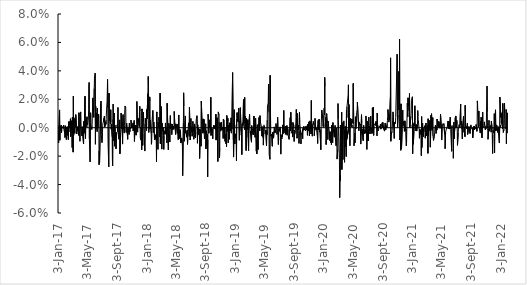
| Category | Series 0 |
|---|---|
| 2017-01-03 | -0.01 |
| 2017-01-04 | -0.005 |
| 2017-01-05 | -0.011 |
| 2017-01-06 | 0.001 |
| 2017-01-09 | 0.013 |
| 2017-01-10 | -0.009 |
| 2017-01-11 | 0.002 |
| 2017-01-12 | -0.002 |
| 2017-01-13 | 0 |
| 2017-01-16 | 0.002 |
| 2017-01-17 | -0.004 |
| 2017-01-18 | -0.001 |
| 2017-01-19 | -0.002 |
| 2017-01-20 | 0.001 |
| 2017-01-23 | 0 |
| 2017-01-24 | -0.001 |
| 2017-01-25 | 0.001 |
| 2017-01-26 | 0.002 |
| 2017-01-27 | 0.001 |
| 2017-01-30 | -0.004 |
| 2017-01-31 | -0.007 |
| 2017-02-01 | -0.005 |
| 2017-02-02 | 0.001 |
| 2017-02-03 | -0.005 |
| 2017-02-06 | -0.008 |
| 2017-02-07 | -0.005 |
| 2017-02-08 | 0.001 |
| 2017-02-09 | -0.005 |
| 2017-02-10 | 0.001 |
| 2017-02-13 | -0.004 |
| 2017-02-14 | -0.008 |
| 2017-02-15 | 0.004 |
| 2017-02-16 | -0.003 |
| 2017-02-17 | 0.004 |
| 2017-02-20 | 0.003 |
| 2017-02-21 | 0 |
| 2017-02-22 | 0 |
| 2017-02-23 | 0.006 |
| 2017-02-24 | -0.006 |
| 2017-02-27 | 0.005 |
| 2017-02-28 | -0.002 |
| 2017-03-01 | -0.006 |
| 2017-03-02 | -0.014 |
| 2017-03-03 | 0.007 |
| 2017-03-06 | -0.017 |
| 2017-03-07 | 0.022 |
| 2017-03-08 | -0.005 |
| 2017-03-09 | 0.007 |
| 2017-03-10 | 0.003 |
| 2017-03-13 | -0.004 |
| 2017-03-14 | 0.006 |
| 2017-03-15 | 0.001 |
| 2017-03-16 | 0.005 |
| 2017-03-17 | 0.009 |
| 2017-03-20 | 0.001 |
| 2017-03-21 | -0.004 |
| 2017-03-22 | -0.002 |
| 2017-03-23 | 0 |
| 2017-03-24 | -0.002 |
| 2017-03-27 | 0.001 |
| 2017-03-28 | -0.003 |
| 2017-03-29 | -0.005 |
| 2017-03-30 | 0.011 |
| 2017-03-31 | -0.001 |
| 2017-04-03 | -0.01 |
| 2017-04-04 | 0 |
| 2017-04-05 | 0.008 |
| 2017-04-06 | 0.011 |
| 2017-04-07 | 0 |
| 2017-04-10 | -0.005 |
| 2017-04-11 | -0.006 |
| 2017-04-12 | 0.001 |
| 2017-04-13 | 0.001 |
| 2017-04-18 | -0.011 |
| 2017-04-19 | 0.005 |
| 2017-04-20 | -0.002 |
| 2017-04-21 | -0.004 |
| 2017-04-24 | 0.022 |
| 2017-04-25 | 0.003 |
| 2017-04-26 | -0.008 |
| 2017-04-27 | 0.005 |
| 2017-04-28 | 0.001 |
| 2017-05-02 | 0.008 |
| 2017-05-03 | 0.006 |
| 2017-05-04 | 0.002 |
| 2017-05-05 | 0.003 |
| 2017-05-08 | 0.007 |
| 2017-05-09 | 0.013 |
| 2017-05-10 | 0.03 |
| 2017-05-11 | 0.032 |
| 2017-05-12 | -0.008 |
| 2017-05-15 | -0.024 |
| 2017-05-16 | 0.003 |
| 2017-05-17 | 0.011 |
| 2017-05-18 | 0.007 |
| 2017-05-19 | 0 |
| 2017-05-22 | -0.001 |
| 2017-05-23 | 0.001 |
| 2017-05-24 | 0.006 |
| 2017-05-25 | 0.006 |
| 2017-05-26 | 0.021 |
| 2017-05-30 | 0.007 |
| 2017-05-31 | 0.008 |
| 2017-06-01 | 0.028 |
| 2017-06-02 | 0.035 |
| 2017-06-05 | 0.038 |
| 2017-06-06 | -0.012 |
| 2017-06-07 | 0.015 |
| 2017-06-08 | 0.008 |
| 2017-06-09 | 0.01 |
| 2017-06-12 | -0.001 |
| 2017-06-13 | -0.003 |
| 2017-06-14 | 0.014 |
| 2017-06-15 | 0.006 |
| 2017-06-16 | 0 |
| 2017-06-19 | 0.01 |
| 2017-06-20 | 0.007 |
| 2017-06-21 | -0.026 |
| 2017-06-22 | -0.016 |
| 2017-06-23 | -0.024 |
| 2017-06-28 | 0.017 |
| 2017-06-29 | 0.019 |
| 2017-06-30 | -0.005 |
| 2017-07-03 | -0.01 |
| 2017-07-04 | -0.011 |
| 2017-07-05 | -0.003 |
| 2017-07-06 | 0.002 |
| 2017-07-07 | 0.003 |
| 2017-07-10 | 0.005 |
| 2017-07-11 | 0.007 |
| 2017-07-12 | 0.005 |
| 2017-07-13 | 0.008 |
| 2017-07-14 | 0 |
| 2017-07-17 | 0.001 |
| 2017-07-18 | 0.004 |
| 2017-07-19 | 0.002 |
| 2017-07-20 | 0.005 |
| 2017-07-21 | 0.01 |
| 2017-07-24 | 0.019 |
| 2017-07-25 | 0.025 |
| 2017-07-26 | 0.034 |
| 2017-07-27 | 0.014 |
| 2017-07-28 | -0.01 |
| 2017-07-31 | -0.028 |
| 2017-08-01 | 0.024 |
| 2017-08-02 | 0.005 |
| 2017-08-03 | 0.006 |
| 2017-08-04 | 0.008 |
| 2017-08-07 | 0.003 |
| 2017-08-08 | 0.013 |
| 2017-08-09 | 0.004 |
| 2017-08-10 | -0.001 |
| 2017-08-11 | 0.003 |
| 2017-08-14 | -0.006 |
| 2017-08-15 | -0.023 |
| 2017-08-16 | -0.027 |
| 2017-08-17 | 0.006 |
| 2017-08-18 | 0.017 |
| 2017-08-21 | -0.009 |
| 2017-08-22 | 0.01 |
| 2017-08-23 | 0.003 |
| 2017-08-24 | -0.013 |
| 2017-08-25 | 0.002 |
| 2017-08-28 | -0.009 |
| 2017-08-29 | -0.004 |
| 2017-08-30 | -0.015 |
| 2017-08-31 | -0.003 |
| 2017-09-05 | -0.003 |
| 2017-09-06 | 0.006 |
| 2017-09-07 | 0.014 |
| 2017-09-08 | -0.004 |
| 2017-09-11 | -0.008 |
| 2017-09-12 | -0.007 |
| 2017-09-13 | 0.002 |
| 2017-09-14 | 0.006 |
| 2017-09-15 | -0.018 |
| 2017-09-18 | -0.004 |
| 2017-09-19 | -0.001 |
| 2017-09-20 | 0.01 |
| 2017-09-21 | -0.001 |
| 2017-09-22 | 0.009 |
| 2017-09-25 | -0.004 |
| 2017-09-26 | -0.012 |
| 2017-09-27 | 0.004 |
| 2017-09-28 | 0.009 |
| 2017-09-29 | 0 |
| 2017-10-03 | -0.004 |
| 2017-10-04 | 0.001 |
| 2017-10-05 | 0.012 |
| 2017-10-06 | 0.015 |
| 2017-10-09 | 0.014 |
| 2017-10-10 | -0.002 |
| 2017-10-11 | -0.003 |
| 2017-10-12 | 0.002 |
| 2017-10-13 | 0.003 |
| 2017-10-16 | 0.003 |
| 2017-10-17 | -0.008 |
| 2017-10-18 | -0.001 |
| 2017-10-19 | 0 |
| 2017-10-20 | -0.002 |
| 2017-10-23 | -0.005 |
| 2017-10-24 | 0.003 |
| 2017-10-25 | 0.002 |
| 2017-10-26 | -0.003 |
| 2017-10-27 | -0.002 |
| 2017-10-30 | 0.001 |
| 2017-10-31 | 0.005 |
| 2017-11-01 | 0.006 |
| 2017-11-02 | 0 |
| 2017-11-03 | 0.002 |
| 2017-11-06 | 0 |
| 2017-11-07 | 0.002 |
| 2017-11-08 | 0.003 |
| 2017-11-09 | -0.002 |
| 2017-11-10 | 0.002 |
| 2017-11-13 | 0.005 |
| 2017-11-14 | -0.01 |
| 2017-11-15 | -0.009 |
| 2017-11-16 | 0 |
| 2017-11-17 | 0.002 |
| 2017-11-20 | 0.002 |
| 2017-11-21 | -0.005 |
| 2017-11-22 | 0 |
| 2017-11-23 | 0.002 |
| 2017-11-24 | 0.018 |
| 2017-11-27 | -0.003 |
| 2017-11-28 | 0.007 |
| 2017-11-29 | 0.005 |
| 2017-11-30 | 0.006 |
| 2017-12-04 | 0.001 |
| 2017-12-05 | 0.014 |
| 2017-12-06 | 0.015 |
| 2017-12-07 | 0.012 |
| 2017-12-08 | -0.007 |
| 2017-12-11 | -0.009 |
| 2017-12-12 | 0 |
| 2017-12-13 | -0.01 |
| 2017-12-14 | -0.016 |
| 2017-12-15 | 0.013 |
| 2017-12-18 | -0.012 |
| 2017-12-19 | -0.005 |
| 2017-12-20 | 0.004 |
| 2017-12-21 | 0.011 |
| 2017-12-22 | 0.004 |
| 2017-12-27 | -0.016 |
| 2017-12-28 | 0.003 |
| 2017-12-29 | 0.007 |
| 2018-01-02 | 0.001 |
| 2018-01-03 | -0.002 |
| 2018-01-04 | 0.013 |
| 2018-01-05 | 0.006 |
| 2018-01-08 | 0.024 |
| 2018-01-09 | 0.013 |
| 2018-01-10 | 0.036 |
| 2018-01-11 | 0.029 |
| 2018-01-12 | -0.003 |
| 2018-01-15 | 0.005 |
| 2018-01-16 | 0.022 |
| 2018-01-17 | 0.019 |
| 2018-01-18 | -0.001 |
| 2018-01-19 | 0.005 |
| 2018-01-22 | -0.004 |
| 2018-01-23 | -0.012 |
| 2018-01-24 | -0.01 |
| 2018-01-25 | -0.01 |
| 2018-01-26 | 0.006 |
| 2018-01-29 | 0.012 |
| 2018-01-30 | 0.004 |
| 2018-01-31 | -0.003 |
| 2018-02-01 | 0.003 |
| 2018-02-02 | 0.004 |
| 2018-02-05 | -0.008 |
| 2018-02-06 | -0.009 |
| 2018-02-07 | -0.008 |
| 2018-02-08 | -0.005 |
| 2018-02-09 | -0.005 |
| 2018-02-12 | -0.009 |
| 2018-02-13 | -0.024 |
| 2018-02-14 | 0.011 |
| 2018-02-15 | 0.01 |
| 2018-02-16 | 0.001 |
| 2018-02-19 | -0.015 |
| 2018-02-20 | 0.004 |
| 2018-02-21 | 0 |
| 2018-02-22 | 0.002 |
| 2018-02-23 | 0.007 |
| 2018-02-26 | 0 |
| 2018-02-27 | -0.007 |
| 2018-02-28 | 0.024 |
| 2018-03-01 | -0.011 |
| 2018-03-02 | 0.001 |
| 2018-03-05 | 0.015 |
| 2018-03-06 | 0.002 |
| 2018-03-07 | -0.015 |
| 2018-03-08 | 0.003 |
| 2018-03-09 | 0.002 |
| 2018-03-12 | -0.003 |
| 2018-03-13 | 0 |
| 2018-03-14 | -0.005 |
| 2018-03-15 | -0.015 |
| 2018-03-16 | -0.006 |
| 2018-03-19 | -0.002 |
| 2018-03-20 | -0.004 |
| 2018-03-21 | -0.005 |
| 2018-03-22 | 0.003 |
| 2018-03-23 | -0.004 |
| 2018-03-26 | 0 |
| 2018-03-27 | -0.005 |
| 2018-03-28 | -0.011 |
| 2018-03-29 | 0.017 |
| 2018-04-03 | -0.016 |
| 2018-04-04 | -0.003 |
| 2018-04-05 | 0.003 |
| 2018-04-06 | -0.001 |
| 2018-04-09 | -0.01 |
| 2018-04-10 | 0.002 |
| 2018-04-11 | 0.009 |
| 2018-04-12 | -0.001 |
| 2018-04-13 | 0.003 |
| 2018-04-16 | 0.001 |
| 2018-04-17 | -0.005 |
| 2018-04-18 | 0 |
| 2018-04-19 | 0.002 |
| 2018-04-20 | -0.001 |
| 2018-04-23 | -0.001 |
| 2018-04-24 | 0.001 |
| 2018-04-25 | -0.001 |
| 2018-04-26 | 0.001 |
| 2018-04-27 | 0.011 |
| 2018-04-30 | 0.001 |
| 2018-05-02 | 0.001 |
| 2018-05-03 | -0.005 |
| 2018-05-04 | 0.003 |
| 2018-05-07 | 0 |
| 2018-05-08 | -0.002 |
| 2018-05-09 | -0.002 |
| 2018-05-10 | -0.004 |
| 2018-05-11 | 0.003 |
| 2018-05-14 | -0.008 |
| 2018-05-15 | -0.001 |
| 2018-05-16 | 0.009 |
| 2018-05-17 | -0.008 |
| 2018-05-18 | -0.005 |
| 2018-05-21 | -0.001 |
| 2018-05-22 | -0.004 |
| 2018-05-23 | -0.002 |
| 2018-05-24 | -0.011 |
| 2018-05-25 | -0.01 |
| 2018-05-28 | -0.007 |
| 2018-05-30 | -0.011 |
| 2018-05-31 | -0.013 |
| 2018-06-01 | -0.034 |
| 2018-06-04 | 0.004 |
| 2018-06-05 | 0.025 |
| 2018-06-06 | 0.015 |
| 2018-06-07 | 0.016 |
| 2018-06-08 | -0.01 |
| 2018-06-11 | 0.005 |
| 2018-06-12 | 0.008 |
| 2018-06-13 | -0.003 |
| 2018-06-14 | -0.003 |
| 2018-06-19 | -0.007 |
| 2018-06-20 | -0.002 |
| 2018-06-21 | -0.012 |
| 2018-06-22 | -0.008 |
| 2018-06-25 | 0.003 |
| 2018-06-26 | 0 |
| 2018-06-27 | -0.001 |
| 2018-06-28 | -0.006 |
| 2018-06-29 | 0.014 |
| 2018-07-02 | -0.009 |
| 2018-07-03 | -0.009 |
| 2018-07-04 | -0.003 |
| 2018-07-05 | 0.007 |
| 2018-07-06 | -0.003 |
| 2018-07-09 | 0.001 |
| 2018-07-10 | -0.006 |
| 2018-07-11 | -0.005 |
| 2018-07-12 | -0.001 |
| 2018-07-13 | 0.004 |
| 2018-07-16 | -0.003 |
| 2018-07-17 | -0.008 |
| 2018-07-18 | -0.006 |
| 2018-07-19 | -0.007 |
| 2018-07-20 | 0.003 |
| 2018-07-23 | 0.003 |
| 2018-07-24 | -0.007 |
| 2018-07-25 | -0.003 |
| 2018-07-26 | 0.002 |
| 2018-07-27 | 0.006 |
| 2018-07-30 | 0.008 |
| 2018-07-31 | 0.002 |
| 2018-08-01 | -0.011 |
| 2018-08-02 | 0.002 |
| 2018-08-03 | -0.005 |
| 2018-08-06 | -0.001 |
| 2018-08-07 | -0.004 |
| 2018-08-08 | -0.001 |
| 2018-08-09 | -0.002 |
| 2018-08-10 | -0.022 |
| 2018-08-13 | -0.001 |
| 2018-08-14 | -0.003 |
| 2018-08-15 | -0.006 |
| 2018-08-16 | -0.013 |
| 2018-08-17 | 0.019 |
| 2018-08-20 | 0.002 |
| 2018-08-23 | -0.004 |
| 2018-08-24 | 0.006 |
| 2018-08-27 | -0.003 |
| 2018-08-28 | 0.006 |
| 2018-08-29 | -0.004 |
| 2018-08-30 | -0.008 |
| 2018-08-31 | -0.007 |
| 2018-09-03 | 0 |
| 2018-09-04 | 0.003 |
| 2018-09-05 | -0.015 |
| 2018-09-06 | -0.009 |
| 2018-09-07 | -0.002 |
| 2018-09-10 | -0.013 |
| 2018-09-11 | -0.005 |
| 2018-09-12 | -0.035 |
| 2018-09-13 | -0.008 |
| 2018-09-14 | 0.01 |
| 2018-09-17 | -0.004 |
| 2018-09-18 | 0.006 |
| 2018-09-19 | 0 |
| 2018-09-20 | 0.003 |
| 2018-09-21 | 0.002 |
| 2018-09-24 | -0.003 |
| 2018-09-25 | 0.021 |
| 2018-09-26 | -0.005 |
| 2018-09-27 | -0.006 |
| 2018-09-28 | 0 |
| 2018-10-02 | -0.002 |
| 2018-10-03 | -0.008 |
| 2018-10-04 | -0.001 |
| 2018-10-05 | -0.001 |
| 2018-10-08 | 0.002 |
| 2018-10-09 | -0.001 |
| 2018-10-10 | -0.001 |
| 2018-10-11 | 0.001 |
| 2018-10-12 | 0.001 |
| 2018-10-15 | -0.001 |
| 2018-10-16 | 0.01 |
| 2018-10-17 | -0.009 |
| 2018-10-18 | 0.007 |
| 2018-10-19 | 0.005 |
| 2018-10-22 | 0.004 |
| 2018-10-23 | 0.007 |
| 2018-10-24 | -0.024 |
| 2018-10-25 | 0.004 |
| 2018-10-26 | 0.011 |
| 2018-10-29 | 0.009 |
| 2018-10-30 | -0.001 |
| 2018-10-31 | -0.021 |
| 2018-11-01 | -0.014 |
| 2018-11-02 | 0.004 |
| 2018-11-05 | -0.002 |
| 2018-11-06 | 0.003 |
| 2018-11-07 | -0.001 |
| 2018-11-08 | 0.004 |
| 2018-11-09 | -0.001 |
| 2018-11-12 | -0.002 |
| 2018-11-13 | 0 |
| 2018-11-14 | -0.001 |
| 2018-11-15 | -0.008 |
| 2018-11-16 | 0.006 |
| 2018-11-19 | 0.005 |
| 2018-11-21 | -0.008 |
| 2018-11-22 | 0 |
| 2018-11-23 | -0.01 |
| 2018-11-26 | -0.005 |
| 2018-11-27 | -0.011 |
| 2018-11-28 | -0.005 |
| 2018-11-29 | -0.013 |
| 2018-11-30 | 0.009 |
| 2018-12-03 | -0.002 |
| 2018-12-04 | 0.007 |
| 2018-12-05 | 0.005 |
| 2018-12-06 | -0.011 |
| 2018-12-07 | 0.002 |
| 2018-12-10 | -0.008 |
| 2018-12-11 | 0.003 |
| 2018-12-12 | -0.002 |
| 2018-12-13 | -0.002 |
| 2018-12-14 | 0.003 |
| 2018-12-17 | -0.002 |
| 2018-12-18 | 0.007 |
| 2018-12-19 | -0.004 |
| 2018-12-20 | 0.003 |
| 2018-12-21 | -0.001 |
| 2018-12-24 | 0.039 |
| 2018-12-27 | -0.009 |
| 2018-12-28 | -0.021 |
| 2018-12-31 | 0.013 |
| 2019-01-02 | -0.011 |
| 2019-01-03 | -0.01 |
| 2019-01-04 | -0.004 |
| 2019-01-07 | -0.008 |
| 2019-01-08 | -0.012 |
| 2019-01-09 | -0.023 |
| 2019-01-10 | 0.006 |
| 2019-01-11 | 0.011 |
| 2019-01-14 | 0.004 |
| 2019-01-15 | 0.006 |
| 2019-01-16 | 0.011 |
| 2019-01-17 | 0.004 |
| 2019-01-18 | 0.014 |
| 2019-01-21 | -0.009 |
| 2019-01-22 | 0 |
| 2019-01-23 | 0.005 |
| 2019-01-24 | 0.004 |
| 2019-01-25 | 0.014 |
| 2019-01-28 | -0.003 |
| 2019-01-29 | -0.005 |
| 2019-01-30 | -0.001 |
| 2019-01-31 | -0.019 |
| 2019-02-01 | 0.003 |
| 2019-02-04 | 0.004 |
| 2019-02-05 | 0.001 |
| 2019-02-06 | 0.002 |
| 2019-02-07 | 0.02 |
| 2019-02-08 | 0.003 |
| 2019-02-11 | 0.008 |
| 2019-02-12 | 0.021 |
| 2019-02-13 | -0.001 |
| 2019-02-14 | 0.001 |
| 2019-02-15 | 0.008 |
| 2019-02-18 | -0.016 |
| 2019-02-19 | 0.007 |
| 2019-02-20 | 0.006 |
| 2019-02-21 | -0.001 |
| 2019-02-22 | -0.002 |
| 2019-02-25 | 0.006 |
| 2019-02-26 | -0.007 |
| 2019-02-27 | -0.007 |
| 2019-02-28 | -0.016 |
| 2019-03-01 | 0.003 |
| 2019-03-04 | 0.01 |
| 2019-03-05 | 0.001 |
| 2019-03-06 | -0.002 |
| 2019-03-07 | -0.003 |
| 2019-03-08 | -0.003 |
| 2019-03-11 | -0.009 |
| 2019-03-12 | -0.01 |
| 2019-03-13 | 0.001 |
| 2019-03-14 | -0.005 |
| 2019-03-15 | -0.002 |
| 2019-03-18 | -0.001 |
| 2019-03-19 | -0.001 |
| 2019-03-20 | -0.001 |
| 2019-03-21 | -0.005 |
| 2019-03-22 | 0.008 |
| 2019-03-25 | -0.003 |
| 2019-03-26 | 0 |
| 2019-03-27 | -0.007 |
| 2019-03-28 | 0 |
| 2019-03-29 | 0.007 |
| 2019-04-01 | -0.017 |
| 2019-04-02 | -0.01 |
| 2019-04-03 | -0.018 |
| 2019-04-04 | -0.004 |
| 2019-04-05 | 0.002 |
| 2019-04-08 | -0.015 |
| 2019-04-09 | 0 |
| 2019-04-10 | 0.001 |
| 2019-04-11 | 0.005 |
| 2019-04-12 | 0.007 |
| 2019-04-15 | -0.002 |
| 2019-04-16 | 0.008 |
| 2019-04-17 | 0.008 |
| 2019-04-18 | 0.004 |
| 2019-04-23 | 0 |
| 2019-04-24 | -0.006 |
| 2019-04-25 | 0.001 |
| 2019-04-26 | -0.006 |
| 2019-04-29 | -0.007 |
| 2019-04-30 | -0.012 |
| 2019-05-02 | 0 |
| 2019-05-03 | 0.001 |
| 2019-05-06 | -0.001 |
| 2019-05-07 | -0.003 |
| 2019-05-08 | -0.004 |
| 2019-05-09 | -0.002 |
| 2019-05-10 | -0.002 |
| 2019-05-13 | -0.013 |
| 2019-05-14 | -0.002 |
| 2019-05-15 | -0.005 |
| 2019-05-16 | 0.005 |
| 2019-05-17 | 0.015 |
| 2019-05-20 | 0.017 |
| 2019-05-21 | 0.029 |
| 2019-05-22 | 0.031 |
| 2019-05-23 | 0.011 |
| 2019-05-24 | -0.019 |
| 2019-05-27 | -0.022 |
| 2019-05-28 | 0.037 |
| 2019-05-30 | -0.002 |
| 2019-05-31 | -0.006 |
| 2019-06-03 | -0.004 |
| 2019-06-06 | -0.013 |
| 2019-06-07 | -0.003 |
| 2019-06-10 | -0.004 |
| 2019-06-11 | -0.007 |
| 2019-06-13 | -0.002 |
| 2019-06-14 | 0.001 |
| 2019-06-17 | -0.004 |
| 2019-06-18 | -0.004 |
| 2019-06-19 | -0.002 |
| 2019-06-20 | 0 |
| 2019-06-21 | 0.003 |
| 2019-06-24 | -0.001 |
| 2019-06-25 | -0.005 |
| 2019-06-26 | -0.002 |
| 2019-06-27 | 0.005 |
| 2019-06-28 | 0.007 |
| 2019-07-01 | -0.012 |
| 2019-07-02 | -0.007 |
| 2019-07-03 | -0.001 |
| 2019-07-04 | -0.003 |
| 2019-07-05 | -0.001 |
| 2019-07-08 | 0.001 |
| 2019-07-09 | 0.001 |
| 2019-07-10 | -0.002 |
| 2019-07-11 | -0.019 |
| 2019-07-12 | -0.005 |
| 2019-07-15 | -0.008 |
| 2019-07-16 | -0.005 |
| 2019-07-17 | -0.006 |
| 2019-07-18 | -0.006 |
| 2019-07-19 | 0.002 |
| 2019-07-22 | -0.004 |
| 2019-07-23 | 0.012 |
| 2019-07-24 | -0.002 |
| 2019-07-25 | -0.003 |
| 2019-07-26 | -0.003 |
| 2019-07-29 | 0.001 |
| 2019-07-30 | -0.005 |
| 2019-07-31 | -0.004 |
| 2019-08-01 | 0.001 |
| 2019-08-02 | -0.004 |
| 2019-08-05 | 0.002 |
| 2019-08-06 | -0.005 |
| 2019-08-07 | -0.004 |
| 2019-08-08 | 0 |
| 2019-08-09 | -0.004 |
| 2019-08-14 | -0.008 |
| 2019-08-15 | -0.001 |
| 2019-08-16 | -0.005 |
| 2019-08-19 | 0.007 |
| 2019-08-20 | -0.002 |
| 2019-08-21 | 0.011 |
| 2019-08-22 | 0.01 |
| 2019-08-23 | 0.006 |
| 2019-08-26 | -0.004 |
| 2019-08-27 | -0.003 |
| 2019-08-28 | 0 |
| 2019-08-29 | -0.007 |
| 2019-08-30 | 0.004 |
| 2019-09-02 | 0.001 |
| 2019-09-03 | 0.001 |
| 2019-09-04 | -0.01 |
| 2019-09-05 | -0.002 |
| 2019-09-06 | -0.005 |
| 2019-09-09 | -0.002 |
| 2019-09-10 | -0.002 |
| 2019-09-11 | 0.004 |
| 2019-09-12 | 0.01 |
| 2019-09-13 | 0.013 |
| 2019-09-16 | -0.007 |
| 2019-09-17 | -0.006 |
| 2019-09-18 | 0.01 |
| 2019-09-19 | -0.001 |
| 2019-09-20 | 0.002 |
| 2019-09-23 | -0.001 |
| 2019-09-24 | -0.011 |
| 2019-09-25 | -0.003 |
| 2019-09-26 | 0.011 |
| 2019-09-27 | 0.003 |
| 2019-09-30 | -0.002 |
| 2019-10-02 | -0.011 |
| 2019-10-03 | -0.008 |
| 2019-10-04 | -0.004 |
| 2019-10-07 | -0.004 |
| 2019-10-08 | -0.002 |
| 2019-10-09 | -0.008 |
| 2019-10-10 | -0.001 |
| 2019-10-11 | -0.002 |
| 2019-10-14 | 0.001 |
| 2019-10-15 | -0.002 |
| 2019-10-16 | -0.002 |
| 2019-10-17 | -0.001 |
| 2019-10-18 | 0 |
| 2019-10-21 | -0.002 |
| 2019-10-22 | -0.001 |
| 2019-10-23 | 0.001 |
| 2019-10-24 | -0.002 |
| 2019-10-25 | 0 |
| 2019-10-28 | 0.001 |
| 2019-10-29 | -0.005 |
| 2019-10-30 | 0.003 |
| 2019-10-31 | 0.002 |
| 2019-11-01 | -0.002 |
| 2019-11-04 | 0.004 |
| 2019-11-05 | -0.001 |
| 2019-11-06 | -0.006 |
| 2019-11-07 | -0.001 |
| 2019-11-08 | 0.005 |
| 2019-11-12 | 0.005 |
| 2019-11-13 | -0.004 |
| 2019-11-14 | 0.019 |
| 2019-11-15 | 0 |
| 2019-11-18 | -0.006 |
| 2019-11-19 | 0.002 |
| 2019-11-20 | 0.001 |
| 2019-11-21 | 0.004 |
| 2019-11-22 | 0.004 |
| 2019-11-25 | 0.002 |
| 2019-11-26 | -0.006 |
| 2019-11-27 | -0.003 |
| 2019-11-28 | 0.001 |
| 2019-11-29 | 0.007 |
| 2019-12-02 | 0 |
| 2019-12-03 | -0.002 |
| 2019-12-04 | 0 |
| 2019-12-05 | -0.001 |
| 2019-12-06 | -0.002 |
| 2019-12-09 | -0.006 |
| 2019-12-10 | -0.011 |
| 2019-12-11 | 0.002 |
| 2019-12-12 | 0.005 |
| 2019-12-13 | -0.001 |
| 2019-12-16 | 0.006 |
| 2019-12-17 | -0.001 |
| 2019-12-18 | 0 |
| 2019-12-19 | -0.003 |
| 2019-12-20 | -0.002 |
| 2019-12-23 | -0.015 |
| 2019-12-24 | -0.001 |
| 2019-12-27 | 0.012 |
| 2019-12-30 | 0.007 |
| 2019-12-31 | 0.009 |
| 2020-01-02 | 0.001 |
| 2020-01-03 | 0.004 |
| 2020-01-06 | 0.014 |
| 2020-01-07 | 0.009 |
| 2020-01-08 | 0.035 |
| 2020-01-09 | 0.029 |
| 2020-01-10 | 0.001 |
| 2020-01-13 | 0.007 |
| 2020-01-14 | -0.012 |
| 2020-01-15 | -0.008 |
| 2020-01-16 | 0.01 |
| 2020-01-17 | 0.009 |
| 2020-01-20 | 0.003 |
| 2020-01-21 | -0.008 |
| 2020-01-22 | 0 |
| 2020-01-23 | 0.005 |
| 2020-01-24 | 0.001 |
| 2020-01-27 | -0.003 |
| 2020-01-28 | -0.006 |
| 2020-01-29 | -0.009 |
| 2020-01-30 | -0.003 |
| 2020-01-31 | -0.006 |
| 2020-02-03 | -0.011 |
| 2020-02-04 | -0.004 |
| 2020-02-05 | -0.012 |
| 2020-02-06 | 0.002 |
| 2020-02-07 | -0.003 |
| 2020-02-10 | -0.011 |
| 2020-02-11 | 0.004 |
| 2020-02-12 | 0 |
| 2020-02-13 | 0 |
| 2020-02-14 | -0.004 |
| 2020-02-17 | -0.007 |
| 2020-02-18 | -0.001 |
| 2020-02-19 | -0.001 |
| 2020-02-20 | 0.002 |
| 2020-02-21 | -0.007 |
| 2020-02-24 | -0.013 |
| 2020-02-25 | 0 |
| 2020-02-26 | -0.002 |
| 2020-02-27 | -0.006 |
| 2020-02-28 | -0.022 |
| 2020-03-02 | -0.015 |
| 2020-03-03 | 0.017 |
| 2020-03-04 | 0.006 |
| 2020-03-05 | 0.001 |
| 2020-03-06 | -0.006 |
| 2020-03-09 | -0.024 |
| 2020-03-10 | -0.049 |
| 2020-03-11 | -0.033 |
| 2020-03-12 | -0.037 |
| 2020-03-13 | 0.002 |
| 2020-03-16 | -0.001 |
| 2020-03-17 | -0.007 |
| 2020-03-18 | 0.011 |
| 2020-03-19 | -0.029 |
| 2020-03-20 | 0.004 |
| 2020-03-23 | -0.022 |
| 2020-03-24 | 0.002 |
| 2020-03-25 | -0.001 |
| 2020-03-26 | 0.001 |
| 2020-03-27 | 0.005 |
| 2020-03-30 | -0.024 |
| 2020-03-31 | -0.001 |
| 2020-04-01 | -0.009 |
| 2020-04-02 | 0.001 |
| 2020-04-03 | -0.001 |
| 2020-04-06 | -0.02 |
| 2020-04-07 | 0.012 |
| 2020-04-08 | 0.007 |
| 2020-04-09 | 0.015 |
| 2020-04-14 | 0.023 |
| 2020-04-15 | 0.03 |
| 2020-04-16 | 0.001 |
| 2020-04-17 | 0.016 |
| 2020-04-20 | 0 |
| 2020-04-21 | -0.013 |
| 2020-04-22 | 0.007 |
| 2020-04-02 | -0.014 |
| 2020-04-24 | 0.006 |
| 2020-04-27 | 0.001 |
| 2020-04-28 | 0.005 |
| 2020-04-29 | 0.006 |
| 2020-04-30 | 0.007 |
| 2020-05-04 | 0.003 |
| 2020-05-05 | 0.031 |
| 2020-05-06 | 0.014 |
| 2020-05-07 | 0.009 |
| 2020-05-08 | -0.013 |
| 2020-05-11 | -0.004 |
| 2020-05-12 | -0.011 |
| 2020-05-13 | 0.001 |
| 2020-05-14 | 0.008 |
| 2020-05-15 | -0.001 |
| 2020-05-18 | 0.003 |
| 2020-05-19 | 0.011 |
| 2020-05-20 | 0.01 |
| 2020-05-21 | 0.013 |
| 2020-05-22 | 0.018 |
| 2020-05-27 | 0.001 |
| 2020-05-28 | -0.002 |
| 2020-05-29 | 0.004 |
| 2020-06-01 | 0.002 |
| 2020-06-02 | 0.003 |
| 2020-06-03 | 0.001 |
| 2020-06-04 | -0.004 |
| 2020-06-05 | -0.012 |
| 2020-06-08 | 0.009 |
| 2020-06-09 | 0.003 |
| 2020-06-10 | -0.005 |
| 2020-06-11 | -0.001 |
| 2020-06-15 | -0.009 |
| 2020-06-16 | -0.001 |
| 2020-06-17 | 0.002 |
| 2020-06-18 | -0.002 |
| 2020-06-19 | -0.004 |
| 2020-06-22 | -0.002 |
| 2020-06-23 | -0.001 |
| 2020-06-24 | -0.004 |
| 2020-06-25 | -0.001 |
| 2020-06-26 | 0.008 |
| 2020-06-29 | 0.001 |
| 2020-06-30 | -0.015 |
| 2020-07-01 | 0.005 |
| 2020-07-02 | -0.009 |
| 2020-07-03 | -0.002 |
| 2020-07-06 | -0.009 |
| 2020-07-07 | 0 |
| 2020-07-08 | 0.007 |
| 2020-07-09 | 0 |
| 2020-07-10 | 0.001 |
| 2020-07-13 | -0.004 |
| 2020-07-14 | -0.003 |
| 2020-07-15 | 0.001 |
| 2020-07-16 | 0.008 |
| 2020-07-17 | -0.002 |
| 2020-07-20 | -0.001 |
| 2020-07-21 | -0.004 |
| 2020-07-22 | 0 |
| 2020-07-23 | 0.014 |
| 2020-07-24 | -0.003 |
| 2020-07-27 | 0.015 |
| 2020-07-28 | -0.005 |
| 2020-07-29 | 0.002 |
| 2020-08-03 | 0.003 |
| 2020-08-04 | 0.003 |
| 2020-08-05 | 0.002 |
| 2020-08-06 | 0.002 |
| 2020-08-07 | 0.004 |
| 2020-08-10 | -0.001 |
| 2020-08-11 | -0.006 |
| 2020-08-12 | 0.01 |
| 2020-08-13 | 0.004 |
| 2020-08-14 | -0.001 |
| 2020-08-17 | -0.002 |
| 2020-08-18 | 0 |
| 2020-08-19 | 0.001 |
| 2020-08-20 | 0.001 |
| 2020-08-21 | 0.001 |
| 2020-08-24 | 0 |
| 2020-08-25 | 0.002 |
| 2020-08-26 | 0.002 |
| 2020-08-27 | -0.001 |
| 2020-08-28 | 0 |
| 2020-08-31 | 0.001 |
| 2020-09-01 | 0.003 |
| 2020-09-02 | 0.002 |
| 2020-09-03 | 0.002 |
| 2020-09-04 | 0.004 |
| 2020-09-07 | -0.001 |
| 2020-09-11 | -0.002 |
| 2020-09-14 | 0.003 |
| 2020-09-15 | 0 |
| 2020-09-16 | -0.002 |
| 2020-09-17 | -0.001 |
| 2020-09-18 | 0.002 |
| 2020-09-21 | 0 |
| 2020-09-22 | 0.003 |
| 2020-09-23 | 0.005 |
| 2020-09-24 | 0.008 |
| 2020-09-25 | 0.013 |
| 2020-09-28 | 0.007 |
| 2020-09-29 | 0.004 |
| 2020-09-30 | 0.008 |
| 2020-10-02 | 0.005 |
| 2020-10-05 | 0.021 |
| 2020-10-06 | 0.049 |
| 2020-10-07 | -0.01 |
| 2020-10-08 | -0.003 |
| 2020-10-09 | -0.005 |
| 2020-10-12 | -0.003 |
| 2020-10-13 | 0 |
| 2020-10-14 | 0 |
| 2020-10-15 | 0 |
| 2020-10-16 | 0.011 |
| 2020-10-19 | 0 |
| 2020-10-20 | 0 |
| 2020-10-21 | -0.008 |
| 2020-10-22 | 0.004 |
| 2020-10-23 | 0.005 |
| 2020-10-26 | 0.003 |
| 2020-10-27 | 0.007 |
| 2020-11-02 | 0.052 |
| 2020-11-03 | 0.008 |
| 2020-11-04 | 0 |
| 2020-11-05 | 0 |
| 2020-11-06 | 0.009 |
| 2020-11-09 | 0.04 |
| 2020-11-10 | 0.013 |
| 2020-11-11 | 0.019 |
| 2020-11-12 | 0.062 |
| 2020-11-13 | -0.009 |
| 2020-11-16 | -0.007 |
| 2020-11-17 | -0.016 |
| 2020-11-18 | 0.017 |
| 2020-11-19 | -0.005 |
| 2020-11-20 | -0.015 |
| 2020-11-23 | -0.001 |
| 2020-11-24 | 0.006 |
| 2020-11-25 | 0.012 |
| 2020-11-26 | 0.001 |
| 2020-11-27 | 0.002 |
| 2020-11-30 | 0.004 |
| 2020-12-01 | 0.003 |
| 2020-12-02 | -0.003 |
| 2020-12-03 | -0.003 |
| 2020-12-04 | 0.005 |
| 2020-12-07 | -0.002 |
| 2020-12-08 | -0.001 |
| 2020-12-09 | 0 |
| 2020-12-10 | -0.013 |
| 2020-12-11 | -0.009 |
| 2020-12-14 | 0.017 |
| 2020-12-15 | 0.011 |
| 2020-12-16 | 0.008 |
| 2020-12-17 | 0.021 |
| 2020-12-18 | 0.016 |
| 2020-12-21 | 0.017 |
| 2020-12-22 | 0.012 |
| 2020-12-23 | 0.024 |
| 2020-12-24 | 0 |
| 2020-12-29 | 0.008 |
| 2020-12-30 | 0.01 |
| 2020-12-31 | 0.019 |
| 2021-01-04 | 0.022 |
| 2021-01-05 | -0.018 |
| 2021-01-06 | 0.002 |
| 2021-01-07 | 0.003 |
| 2021-01-08 | -0.012 |
| 2021-01-11 | 0.001 |
| 2021-01-12 | 0.004 |
| 2021-01-13 | 0.001 |
| 2021-01-14 | 0.015 |
| 2021-01-15 | 0.005 |
| 2021-01-18 | -0.002 |
| 2021-01-19 | -0.001 |
| 2021-01-20 | 0.002 |
| 2021-01-21 | -0.001 |
| 2021-01-22 | -0.002 |
| 2021-01-25 | 0.002 |
| 2021-01-26 | 0.012 |
| 2021-01-27 | 0.008 |
| 2021-01-28 | 0.006 |
| 2021-01-29 | 0.006 |
| 2021-02-01 | -0.001 |
| 2021-02-02 | -0.007 |
| 2021-02-03 | -0.001 |
| 2021-02-04 | -0.005 |
| 2021-02-05 | -0.002 |
| 2021-02-08 | -0.003 |
| 2021-02-09 | -0.001 |
| 2021-02-10 | -0.02 |
| 2021-02-11 | 0.008 |
| 2021-02-12 | -0.014 |
| 2021-02-15 | 0.003 |
| 2021-02-16 | -0.002 |
| 2021-02-17 | -0.001 |
| 2021-02-18 | -0.006 |
| 2021-02-19 | -0.001 |
| 2021-02-22 | -0.001 |
| 2021-02-23 | 0 |
| 2021-02-24 | 0.001 |
| 2021-02-25 | -0.003 |
| 2021-02-26 | -0.007 |
| 2021-03-01 | 0.003 |
| 2021-03-02 | -0.006 |
| 2021-03-03 | -0.004 |
| 2021-03-04 | -0.004 |
| 2021-03-05 | -0.001 |
| 2021-03-08 | 0.002 |
| 2021-03-09 | -0.018 |
| 2021-03-10 | 0.006 |
| 2021-03-11 | -0.006 |
| 2021-03-12 | -0.002 |
| 2021-03-15 | -0.002 |
| 2021-03-16 | 0.004 |
| 2021-03-17 | 0 |
| 2021-03-18 | 0.005 |
| 2021-03-19 | -0.014 |
| 2021-03-22 | 0.009 |
| 2021-03-23 | 0 |
| 2021-03-24 | 0.01 |
| 2021-03-25 | 0.005 |
| 2021-03-26 | -0.002 |
| 2021-03-29 | 0.007 |
| 2021-03-30 | -0.006 |
| 2021-04-01 | -0.009 |
| 2021-04-06 | -0.004 |
| 2021-04-07 | 0 |
| 2021-04-08 | 0.001 |
| 2021-04-09 | 0.002 |
| 2021-04-12 | -0.004 |
| 2021-04-13 | -0.003 |
| 2021-04-14 | 0.001 |
| 2021-04-15 | -0.002 |
| 2021-04-16 | 0.006 |
| 2021-04-19 | 0.001 |
| 2021-04-20 | 0.004 |
| 2021-04-21 | 0.003 |
| 2021-04-22 | 0 |
| 2021-04-23 | 0.004 |
| 2021-04-26 | 0 |
| 2021-04-28 | 0 |
| 2021-04-29 | 0.004 |
| 2021-04-30 | 0.01 |
| 2021-05-04 | -0.001 |
| 2021-05-05 | -0.009 |
| 2021-05-06 | -0.009 |
| 2021-05-07 | 0.002 |
| 2021-05-10 | 0.003 |
| 2021-05-11 | 0.002 |
| 2021-05-14 | 0.003 |
| 2021-05-17 | -0.005 |
| 2021-05-18 | -0.007 |
| 2021-05-19 | -0.015 |
| 2021-05-21 | -0.003 |
| 2021-05-24 | -0.001 |
| 2021-05-25 | -0.001 |
| 2021-05-26 | -0.001 |
| 2021-05-28 | 0.001 |
| 2021-05-31 | 0.005 |
| 2021-06-01 | -0.001 |
| 2021-06-02 | 0.002 |
| 2021-06-03 | 0.002 |
| 2021-06-04 | 0.005 |
| 2021-06-07 | -0.001 |
| 2021-06-08 | 0.005 |
| 2021-06-09 | 0.007 |
| 2021-06-10 | 0.001 |
| 2021-06-11 | -0.001 |
| 2021-06-15 | -0.017 |
| 2021-06-16 | 0.001 |
| 2021-06-17 | 0.001 |
| 2021-06-18 | 0.001 |
| 2021-06-21 | 0.001 |
| 2021-06-22 | -0.021 |
| 2021-06-23 | -0.001 |
| 2021-06-24 | 0.004 |
| 2021-06-25 | -0.008 |
| 2021-06-28 | 0 |
| 2021-06-29 | 0 |
| 2021-06-30 | 0.007 |
| 2021-07-01 | 0 |
| 2021-07-02 | 0.008 |
| 2021-07-05 | 0 |
| 2021-07-06 | 0.005 |
| 2021-07-07 | 0.002 |
| 2021-07-08 | -0.001 |
| 2021-07-09 | -0.012 |
| 2021-07-12 | -0.004 |
| 2021-07-13 | 0 |
| 2021-07-14 | 0 |
| 2021-07-15 | 0 |
| 2021-07-16 | 0.002 |
| 2021-07-19 | 0 |
| 2021-07-22 | 0.017 |
| 2021-07-23 | 0.002 |
| 2021-07-26 | 0.005 |
| 2021-07-27 | -0.001 |
| 2021-07-28 | -0.001 |
| 2021-07-29 | -0.008 |
| 2021-07-30 | 0.002 |
| 2021-08-02 | 0.001 |
| 2021-08-03 | 0.008 |
| 2021-08-04 | 0 |
| 2021-08-05 | -0.003 |
| 2021-08-06 | 0 |
| 2021-08-09 | -0.006 |
| 2021-08-10 | 0.016 |
| 2021-08-11 | 0.007 |
| 2021-08-12 | 0.001 |
| 2021-08-13 | 0.001 |
| 2021-08-16 | -0.001 |
| 2021-08-17 | 0.001 |
| 2021-08-18 | 0 |
| 2021-08-19 | 0.003 |
| 2021-08-20 | -0.005 |
| 2021-08-23 | -0.001 |
| 2021-08-24 | 0.001 |
| 2021-08-25 | 0 |
| 2021-08-26 | 0.001 |
| 2021-08-27 | 0 |
| 2021-08-30 | -0.004 |
| 2021-08-31 | -0.003 |
| 2021-09-01 | -0.001 |
| 2021-09-02 | 0.002 |
| 2021-09-03 | 0 |
| 2021-09-06 | 0 |
| 2021-09-07 | 0 |
| 2021-09-08 | -0.001 |
| 2021-09-09 | 0 |
| 2021-09-10 | -0.007 |
| 2021-09-13 | 0 |
| 2021-09-14 | 0 |
| 2021-09-15 | 0.001 |
| 2021-09-16 | -0.001 |
| 2021-09-17 | 0.001 |
| 2021-09-20 | -0.001 |
| 2021-09-21 | -0.001 |
| 2021-09-22 | -0.001 |
| 2021-09-23 | 0.001 |
| 2021-09-24 | 0.002 |
| 2021-09-27 | -0.003 |
| 2021-09-28 | 0 |
| 2021-09-29 | 0.019 |
| 2021-09-30 | 0.016 |
| 2021-10-04 | 0.001 |
| 2021-10-05 | 0.012 |
| 2021-10-06 | 0.001 |
| 2021-10-07 | 0.002 |
| 2021-10-08 | 0.001 |
| 2021-10-11 | -0.004 |
| 2021-10-12 | 0.004 |
| 2021-10-13 | 0.004 |
| 2021-10-14 | 0.002 |
| 2021-10-15 | 0.007 |
| 2021-10-18 | -0.007 |
| 2021-10-20 | 0.003 |
| 2021-10-21 | 0.011 |
| 2021-10-22 | 0.001 |
| 2021-10-25 | 0.001 |
| 2021-10-26 | 0 |
| 2021-10-27 | -0.001 |
| 2021-10-28 | 0.004 |
| 2021-10-29 | 0.002 |
| 2021-11-01 | -0.001 |
| 2021-11-02 | 0.001 |
| 2021-11-03 | -0.001 |
| 2021-11-04 | -0.001 |
| 2021-11-05 | 0.002 |
| 2021-11-08 | 0.029 |
| 2021-11-09 | 0.011 |
| 2021-11-10 | -0.001 |
| 2021-11-11 | -0.002 |
| 2021-11-12 | -0.008 |
| 2021-11-15 | -0.001 |
| 2021-11-16 | 0.005 |
| 2021-11-17 | -0.002 |
| 2021-11-18 | -0.001 |
| 2021-11-19 | -0.002 |
| 2021-11-22 | 0.002 |
| 2021-11-23 | 0 |
| 2021-11-24 | 0 |
| 2021-11-25 | -0.003 |
| 2021-11-26 | 0.005 |
| 2021-11-29 | -0.001 |
| 2021-11-30 | -0.001 |
| 2021-12-01 | -0.018 |
| 2021-12-02 | -0.005 |
| 2021-12-03 | -0.002 |
| 2021-12-06 | -0.004 |
| 2021-12-07 | 0 |
| 2021-12-08 | 0.01 |
| 2021-12-09 | -0.018 |
| 2021-12-10 | 0.005 |
| 2021-12-13 | 0.013 |
| 2021-12-14 | -0.002 |
| 2021-12-15 | 0.001 |
| 2021-12-16 | -0.002 |
| 2021-12-17 | 0.002 |
| 2021-12-20 | 0.001 |
| 2021-12-21 | 0 |
| 2021-12-22 | -0.003 |
| 2021-12-23 | 0 |
| 2021-12-24 | 0.001 |
| 2021-12-29 | -0.011 |
| 2021-12-30 | 0 |
| 2021-12-31 | 0.022 |
| 2022-01-04 | 0.007 |
| 2022-01-05 | 0.01 |
| 2022-01-06 | 0.003 |
| 2022-01-07 | 0.006 |
| 2022-01-10 | 0.001 |
| 2022-01-11 | -0.001 |
| 2022-01-12 | 0.017 |
| 2022-01-13 | 0 |
| 2022-01-14 | -0.003 |
| 2022-01-17 | -0.001 |
| 2022-01-18 | 0.006 |
| 2022-01-19 | 0.017 |
| 2022-01-20 | 0.01 |
| 2022-01-21 | 0.001 |
| 2022-01-24 | -0.001 |
| 2022-01-25 | 0 |
| 2022-01-26 | 0.013 |
| 2022-01-27 | -0.011 |
| 2022-01-28 | 0.004 |
| 2022-01-31 | 0.009 |
| 2022-02-01 | 0.01 |
| 2022-02-02 | -0.004 |